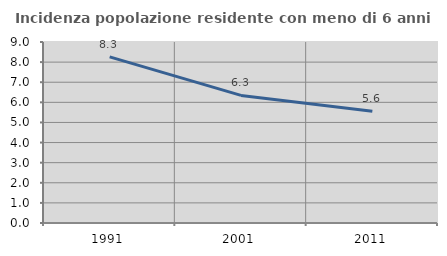
| Category | Incidenza popolazione residente con meno di 6 anni |
|---|---|
| 1991.0 | 8.263 |
| 2001.0 | 6.344 |
| 2011.0 | 5.56 |